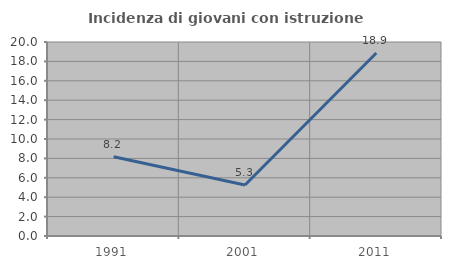
| Category | Incidenza di giovani con istruzione universitaria |
|---|---|
| 1991.0 | 8.163 |
| 2001.0 | 5.263 |
| 2011.0 | 18.868 |